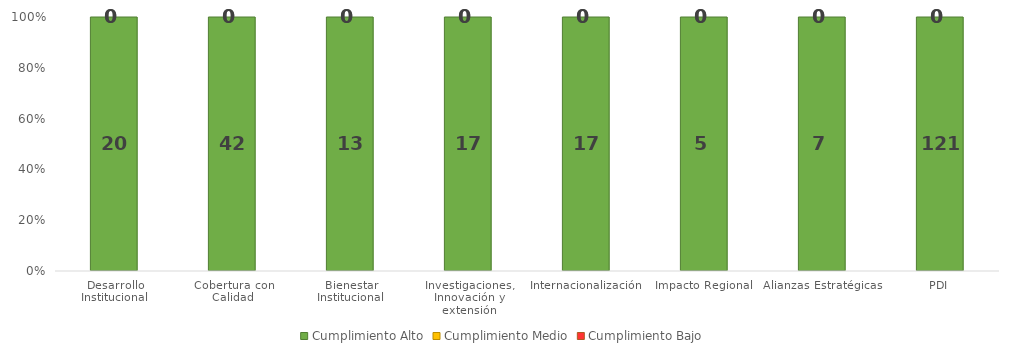
| Category | Cumplimiento Alto | Cumplimiento Medio | Cumplimiento Bajo |
|---|---|---|---|
| Desarrollo Institucional | 20 | 0 | 0 |
| Cobertura con Calidad | 42 | 0 | 0 |
| Bienestar Institucional | 13 | 0 | 0 |
| Investigaciones, Innovación y extensión | 17 | 0 | 0 |
| Internacionalización | 17 | 0 | 0 |
| Impacto Regional | 5 | 0 | 0 |
| Alianzas Estratégicas | 7 | 0 | 0 |
| PDI | 121 | 0 | 0 |